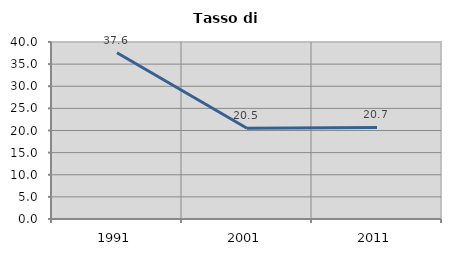
| Category | Tasso di disoccupazione   |
|---|---|
| 1991.0 | 37.565 |
| 2001.0 | 20.505 |
| 2011.0 | 20.682 |